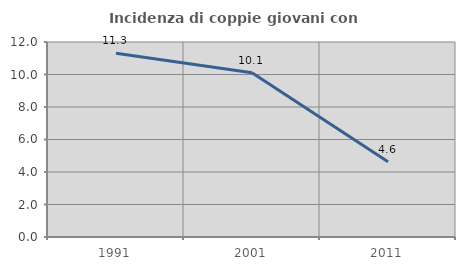
| Category | Incidenza di coppie giovani con figli |
|---|---|
| 1991.0 | 11.31 |
| 2001.0 | 10.105 |
| 2011.0 | 4.633 |